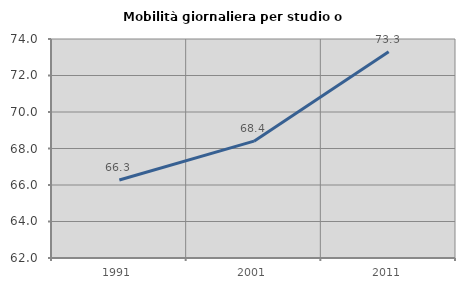
| Category | Mobilità giornaliera per studio o lavoro |
|---|---|
| 1991.0 | 66.271 |
| 2001.0 | 68.403 |
| 2011.0 | 73.3 |